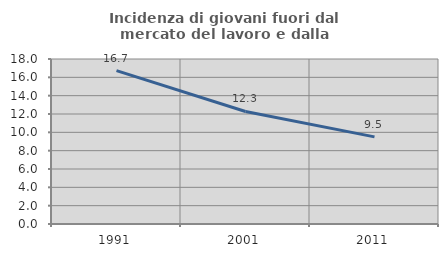
| Category | Incidenza di giovani fuori dal mercato del lavoro e dalla formazione  |
|---|---|
| 1991.0 | 16.728 |
| 2001.0 | 12.277 |
| 2011.0 | 9.506 |